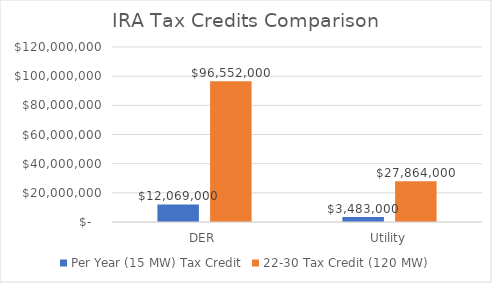
| Category | Per Year (15 MW) Tax Credit | 22-30 Tax Credit (120 MW) |
|---|---|---|
| DER | 12069000 | 96552000 |
| Utility | 3483000 | 27864000 |